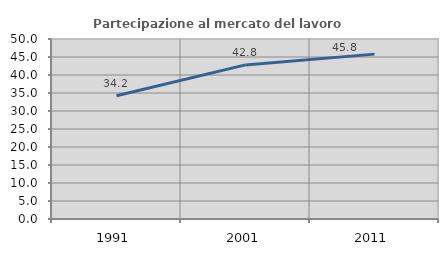
| Category | Partecipazione al mercato del lavoro  femminile |
|---|---|
| 1991.0 | 34.221 |
| 2001.0 | 42.806 |
| 2011.0 | 45.799 |